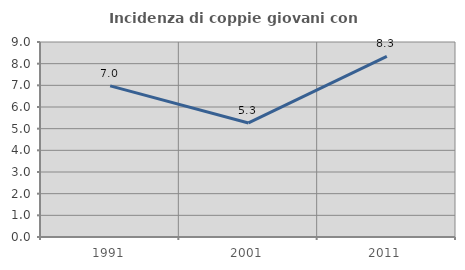
| Category | Incidenza di coppie giovani con figli |
|---|---|
| 1991.0 | 6.977 |
| 2001.0 | 5.263 |
| 2011.0 | 8.333 |